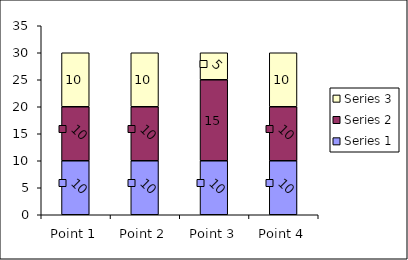
| Category | Series 1 | Series 2 | Series 3 |
|---|---|---|---|
| Point 1 | 10 | 10 | 10 |
| Point 2 | 10 | 10 | 10 |
| Point 3 | 10 | 15 | 5 |
| Point 4 | 10 | 10 | 10 |